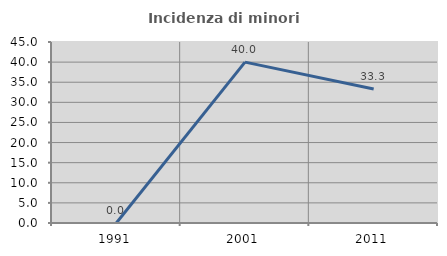
| Category | Incidenza di minori stranieri |
|---|---|
| 1991.0 | 0 |
| 2001.0 | 40 |
| 2011.0 | 33.333 |